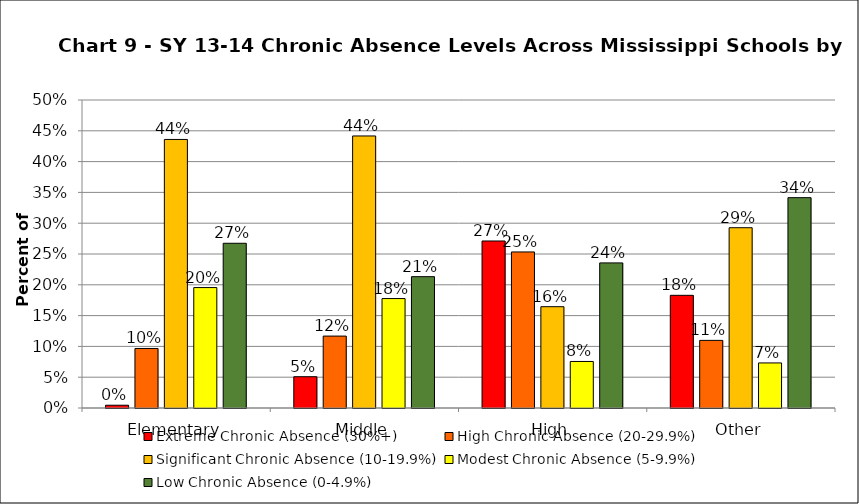
| Category | Extreme Chronic Absence (30%+) | High Chronic Absence (20-29.9%) | Significant Chronic Absence (10-19.9%) | Modest Chronic Absence (5-9.9%) | Low Chronic Absence (0-4.9%) |
|---|---|---|---|---|---|
| 0 | 0.004 | 0.097 | 0.436 | 0.196 | 0.267 |
| 1 | 0.051 | 0.117 | 0.442 | 0.178 | 0.213 |
| 2 | 0.271 | 0.253 | 0.164 | 0.076 | 0.236 |
| 3 | 0.183 | 0.11 | 0.293 | 0.073 | 0.341 |